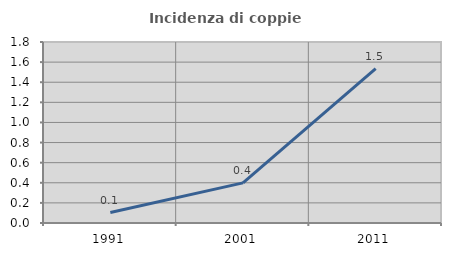
| Category | Incidenza di coppie miste |
|---|---|
| 1991.0 | 0.104 |
| 2001.0 | 0.399 |
| 2011.0 | 1.536 |